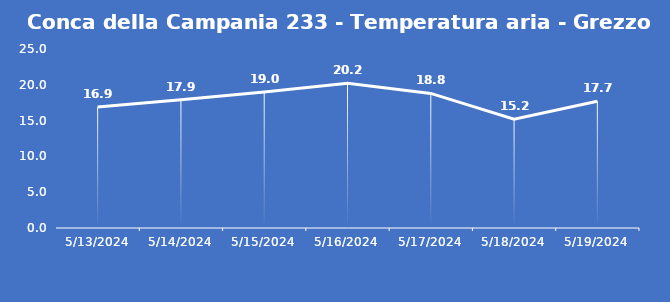
| Category | Conca della Campania 233 - Temperatura aria - Grezzo (°C) |
|---|---|
| 5/13/24 | 16.9 |
| 5/14/24 | 17.9 |
| 5/15/24 | 19 |
| 5/16/24 | 20.2 |
| 5/17/24 | 18.8 |
| 5/18/24 | 15.2 |
| 5/19/24 | 17.7 |